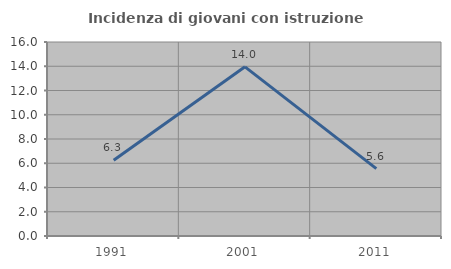
| Category | Incidenza di giovani con istruzione universitaria |
|---|---|
| 1991.0 | 6.25 |
| 2001.0 | 13.953 |
| 2011.0 | 5.556 |